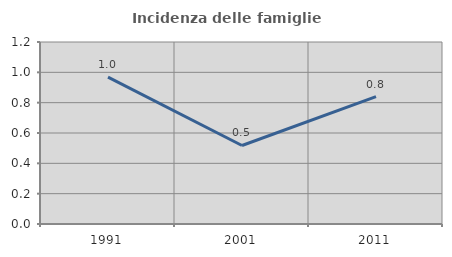
| Category | Incidenza delle famiglie numerose |
|---|---|
| 1991.0 | 0.968 |
| 2001.0 | 0.518 |
| 2011.0 | 0.84 |